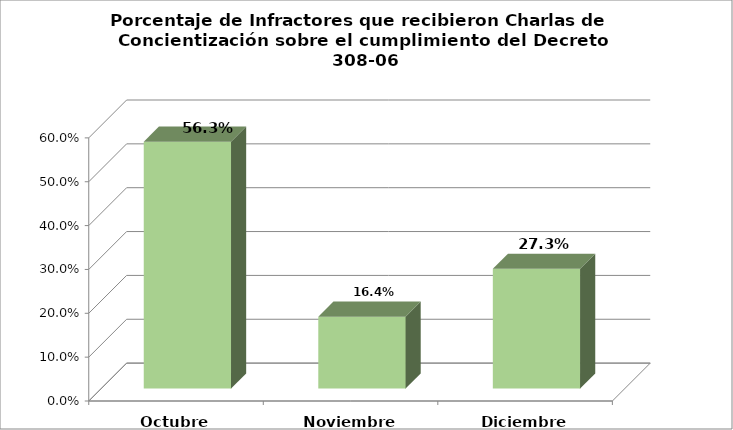
| Category | Series 0 |
|---|---|
| Octubre | 0.563 |
| Noviembre | 0.164 |
| Diciembre | 0.273 |